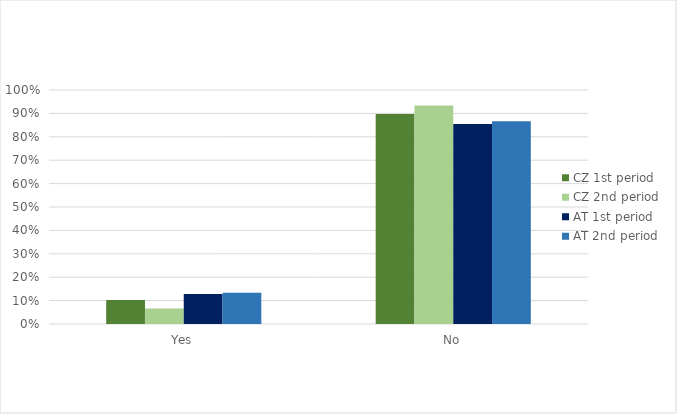
| Category | CZ 1st period | CZ 2nd period | AT 1st period | AT 2nd period |
|---|---|---|---|---|
| Yes | 0.103 | 0.067 | 0.128 | 0.133 |
| No | 0.897 | 0.933 | 0.855 | 0.867 |